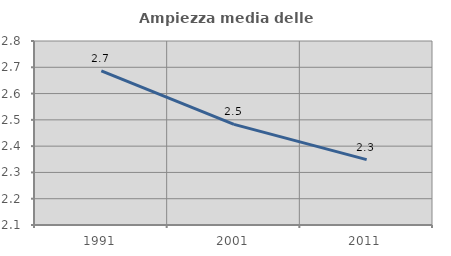
| Category | Ampiezza media delle famiglie |
|---|---|
| 1991.0 | 2.687 |
| 2001.0 | 2.483 |
| 2011.0 | 2.349 |